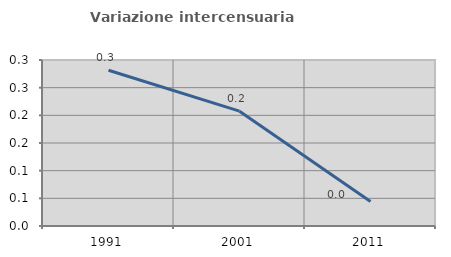
| Category | Variazione intercensuaria annua |
|---|---|
| 1991.0 | 0.281 |
| 2001.0 | 0.208 |
| 2011.0 | 0.044 |